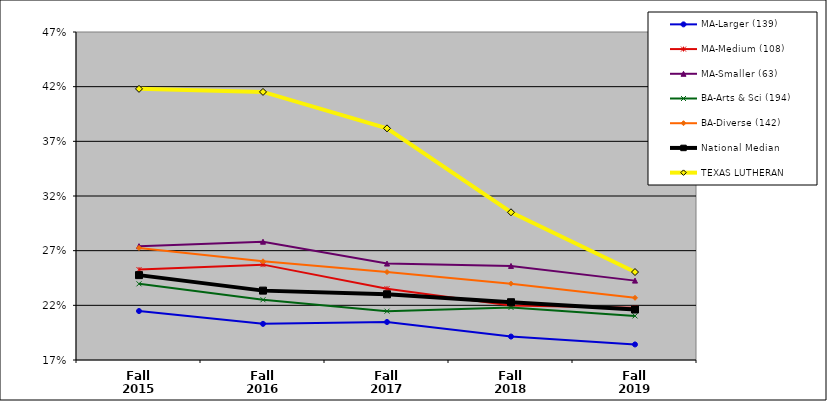
| Category | MA-Larger (139) | MA-Medium (108) | MA-Smaller (63) | BA-Arts & Sci (194) | BA-Diverse (142) | National Median | TEXAS LUTHERAN |
|---|---|---|---|---|---|---|---|
| Fall 2015 | 0.215 | 0.253 | 0.274 | 0.24 | 0.273 | 0.248 | 0.418 |
| Fall 2016 | 0.203 | 0.257 | 0.278 | 0.225 | 0.26 | 0.233 | 0.415 |
| Fall 2017 | 0.205 | 0.235 | 0.258 | 0.215 | 0.25 | 0.23 | 0.382 |
| Fall 2018 | 0.191 | 0.22 | 0.256 | 0.218 | 0.24 | 0.223 | 0.305 |
| Fall 2019 | 0.184 | 0.218 | 0.243 | 0.21 | 0.227 | 0.216 | 0.25 |